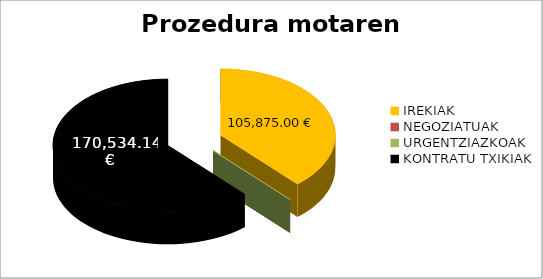
| Category | Prozedura motaren arabera |
|---|---|
| IREKIAK | 105875 |
| NEGOZIATUAK | 0 |
| URGENTZIAZKOAK | 0 |
| KONTRATU TXIKIAK | 170534.14 |